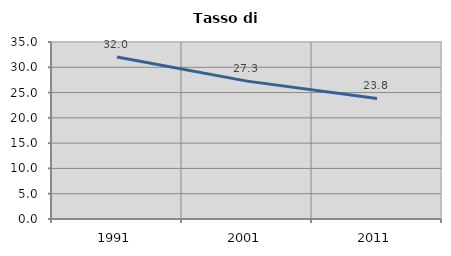
| Category | Tasso di disoccupazione   |
|---|---|
| 1991.0 | 32.028 |
| 2001.0 | 27.263 |
| 2011.0 | 23.834 |